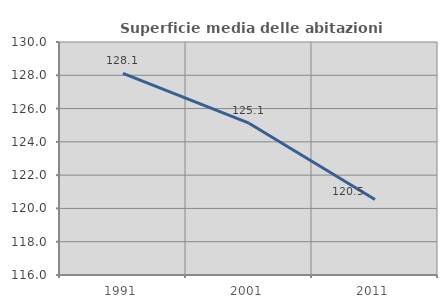
| Category | Superficie media delle abitazioni occupate |
|---|---|
| 1991.0 | 128.117 |
| 2001.0 | 125.122 |
| 2011.0 | 120.535 |